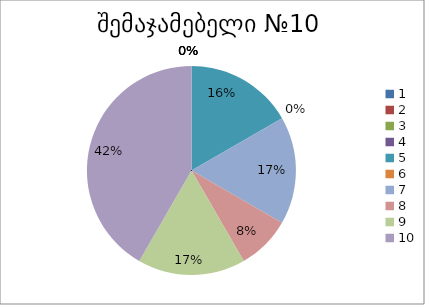
| Category | რაოდენობა | ქულა |
|---|---|---|
| 0 | 0 | 1 |
| 1 | 0 | 2 |
| 2 | 0 | 3 |
| 3 | 0 | 4 |
| 4 | 2 | 5 |
| 5 | 0 | 6 |
| 6 | 2 | 7 |
| 7 | 1 | 8 |
| 8 | 2 | 9 |
| 9 | 5 | 10 |